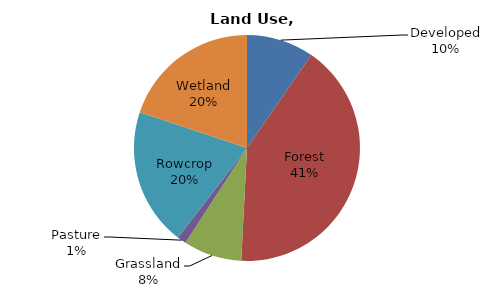
| Category | Series 0 |
|---|---|
| Developed | 204.224 |
| Forest | 872.642 |
| Grassland | 176.965 |
| Pasture | 27.534 |
| Rowcrop | 416.605 |
| Wetland | 421.067 |